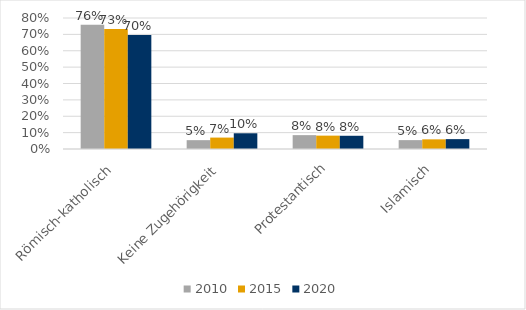
| Category | 2010 | 2015 | 2020 |
|---|---|---|---|
| Römisch-katholisch | 0.759 | 0.734 | 0.696 |
| Keine Zugehörigkeit | 0.054 | 0.07 | 0.096 |
| Protestantisch | 0.085 | 0.082 | 0.081 |
| Islamisch | 0.054 | 0.059 | 0.06 |